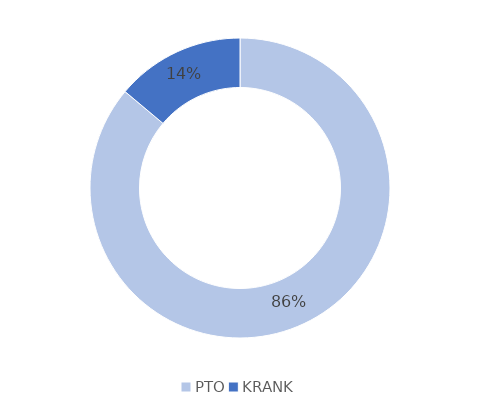
| Category | Series 0 |
|---|---|
| PTO | 31 |
| KRANK | 5 |